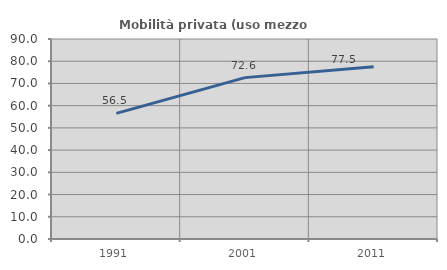
| Category | Mobilità privata (uso mezzo privato) |
|---|---|
| 1991.0 | 56.527 |
| 2001.0 | 72.618 |
| 2011.0 | 77.49 |